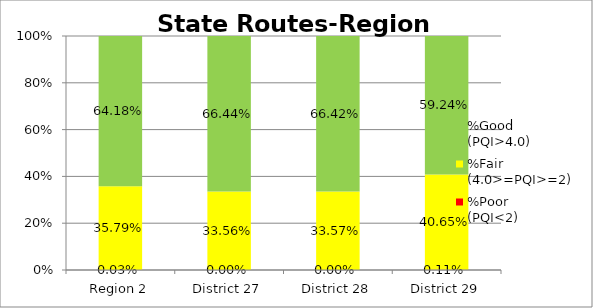
| Category | %Poor
(PQI<2) | %Fair
(4.0>=PQI>=2) | %Good
(PQI>4.0) |
|---|---|---|---|
| Region 2 | 0 | 0.358 | 0.642 |
| District 27 | 0 | 0.336 | 0.664 |
| District 28 | 0 | 0.336 | 0.664 |
| District 29 | 0.001 | 0.407 | 0.592 |